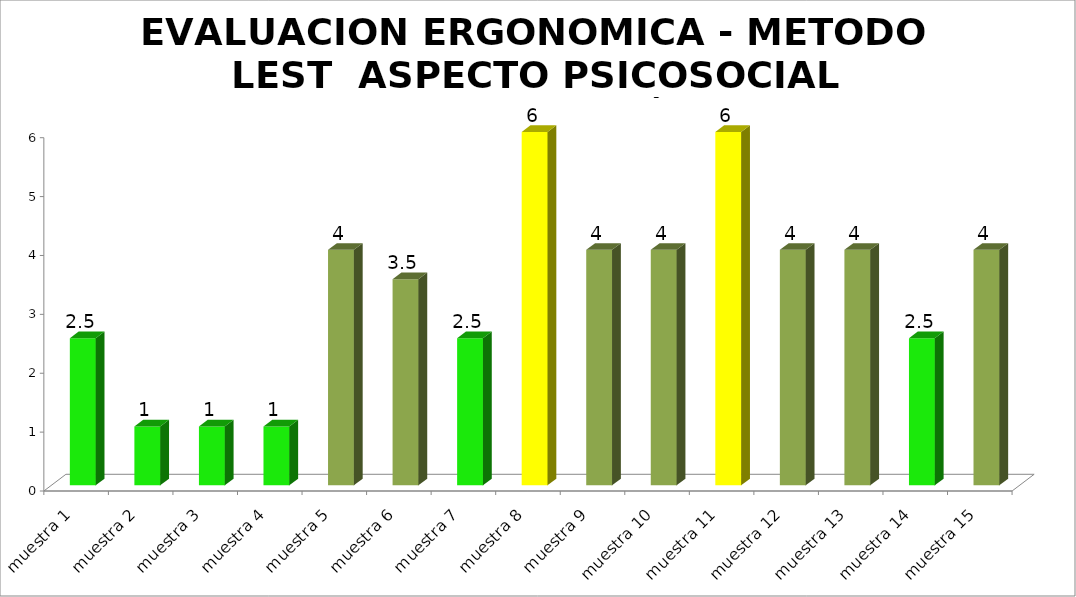
| Category | EVALUACION ERGONOMICA - METODO LEST  |
|---|---|
| muestra 1 | 2.5 |
| muestra 2 | 1 |
| muestra 3 | 1 |
| muestra 4 | 1 |
| muestra 5 | 4 |
| muestra 6 | 3.5 |
| muestra 7 | 2.5 |
| muestra 8 | 6 |
| muestra 9 | 4 |
| muestra 10 | 4 |
| muestra 11 | 6 |
| muestra 12 | 4 |
| muestra 13 | 4 |
| muestra 14 | 2.5 |
| muestra 15 | 4 |